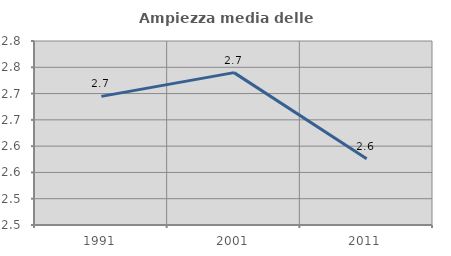
| Category | Ampiezza media delle famiglie |
|---|---|
| 1991.0 | 2.695 |
| 2001.0 | 2.74 |
| 2011.0 | 2.576 |